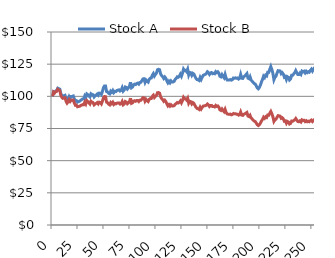
| Category | Stock A | Stock B |
|---|---|---|
| 0.0 | 100 | 100 |
| 1.0 | 103.482 | 103.324 |
| 2.0 | 102.987 | 102.665 |
| 3.0 | 104.154 | 103.666 |
| 4.0 | 104.502 | 103.847 |
| 5.0 | 106.321 | 105.49 |
| 6.0 | 105.913 | 104.918 |
| 7.0 | 105.617 | 104.458 |
| 8.0 | 102.056 | 100.77 |
| 9.0 | 100.69 | 99.262 |
| 10.0 | 100.043 | 98.466 |
| 11.0 | 100.534 | 98.793 |
| 12.0 | 100.836 | 98.933 |
| 13.0 | 98.269 | 96.257 |
| 14.0 | 96.827 | 94.692 |
| 15.0 | 98.031 | 95.72 |
| 16.0 | 99.93 | 97.421 |
| 17.0 | 98.675 | 96.043 |
| 18.0 | 99.88 | 97.063 |
| 19.0 | 99.993 | 97.02 |
| 20.0 | 100.287 | 97.151 |
| 21.0 | 97.98 | 94.761 |
| 22.0 | 96.364 | 93.048 |
| 23.0 | 96.65 | 93.177 |
| 24.0 | 95.479 | 91.9 |
| 25.0 | 95.886 | 92.146 |
| 26.0 | 96.125 | 92.229 |
| 27.0 | 96.912 | 92.838 |
| 28.0 | 97.382 | 93.141 |
| 29.0 | 98.019 | 93.603 |
| 30.0 | 98.065 | 93.498 |
| 31.0 | 100.311 | 95.491 |
| 32.0 | 99.001 | 94.092 |
| 33.0 | 101.878 | 96.677 |
| 34.0 | 101.281 | 95.957 |
| 35.0 | 100.401 | 94.971 |
| 36.0 | 99.585 | 94.048 |
| 37.0 | 101.993 | 96.173 |
| 38.0 | 101.399 | 95.461 |
| 39.0 | 101.207 | 95.128 |
| 40.0 | 99.523 | 93.395 |
| 41.0 | 100.5 | 94.163 |
| 42.0 | 101.056 | 94.534 |
| 43.0 | 101.867 | 95.143 |
| 44.0 | 100.933 | 94.12 |
| 45.0 | 102.502 | 95.434 |
| 46.0 | 102.422 | 95.208 |
| 47.0 | 101.455 | 94.158 |
| 48.0 | 103.865 | 96.245 |
| 49.0 | 106.741 | 98.757 |
| 50.0 | 108.087 | 99.846 |
| 51.0 | 108.09 | 99.69 |
| 52.0 | 103.713 | 95.495 |
| 53.0 | 103.385 | 95.041 |
| 54.0 | 102.368 | 93.955 |
| 55.0 | 101.915 | 93.39 |
| 56.0 | 104.022 | 95.173 |
| 57.0 | 103.231 | 94.298 |
| 58.0 | 104.588 | 95.388 |
| 59.0 | 102.919 | 93.714 |
| 60.0 | 103.911 | 94.469 |
| 61.0 | 103.734 | 94.159 |
| 62.0 | 104.549 | 94.749 |
| 63.0 | 104.855 | 94.875 |
| 64.0 | 105.026 | 94.879 |
| 65.0 | 104.146 | 93.934 |
| 66.0 | 104.646 | 94.236 |
| 67.0 | 106.641 | 95.883 |
| 68.0 | 104.056 | 93.407 |
| 69.0 | 104.942 | 94.053 |
| 70.0 | 107.267 | 95.988 |
| 71.0 | 106.932 | 95.536 |
| 72.0 | 105.653 | 94.242 |
| 73.0 | 106.625 | 94.958 |
| 74.0 | 107.642 | 95.714 |
| 75.0 | 111.021 | 98.566 |
| 76.0 | 106.684 | 94.56 |
| 77.0 | 107.302 | 94.957 |
| 78.0 | 108.952 | 96.266 |
| 79.0 | 109.485 | 96.585 |
| 80.0 | 109.181 | 96.163 |
| 81.0 | 110 | 96.732 |
| 82.0 | 110.263 | 96.809 |
| 83.0 | 109.486 | 95.974 |
| 84.0 | 110.79 | 96.964 |
| 85.0 | 110.978 | 96.975 |
| 86.0 | 112.23 | 97.915 |
| 87.0 | 113.564 | 98.924 |
| 88.0 | 113.596 | 98.795 |
| 89.0 | 110.84 | 96.241 |
| 90.0 | 112.597 | 97.614 |
| 91.0 | 111.574 | 96.572 |
| 92.0 | 111.012 | 95.932 |
| 93.0 | 113.209 | 97.678 |
| 94.0 | 114.055 | 98.253 |
| 95.0 | 114.249 | 98.265 |
| 96.0 | 116.414 | 99.97 |
| 97.0 | 117.651 | 100.875 |
| 98.0 | 115.775 | 99.105 |
| 99.0 | 117.011 | 100.007 |
| 100.0 | 118.086 | 100.766 |
| 101.0 | 120.702 | 102.839 |
| 102.0 | 120.995 | 102.925 |
| 103.0 | 120.645 | 102.464 |
| 104.0 | 117.394 | 99.54 |
| 105.0 | 116.051 | 98.244 |
| 106.0 | 115.331 | 97.478 |
| 107.0 | 113.944 | 96.151 |
| 108.0 | 115.064 | 96.943 |
| 109.0 | 114.048 | 95.933 |
| 110.0 | 112.067 | 94.115 |
| 111.0 | 110.487 | 92.639 |
| 112.0 | 111.78 | 93.576 |
| 113.0 | 110.561 | 92.407 |
| 114.0 | 111.972 | 93.439 |
| 115.0 | 111.096 | 92.56 |
| 116.0 | 111.197 | 92.498 |
| 117.0 | 111.653 | 92.729 |
| 118.0 | 113.178 | 93.849 |
| 119.0 | 114.001 | 94.382 |
| 120.0 | 115.167 | 95.198 |
| 121.0 | 114.864 | 94.797 |
| 122.0 | 115.697 | 95.334 |
| 123.0 | 117.235 | 96.449 |
| 124.0 | 115.598 | 94.95 |
| 125.0 | 117.906 | 96.694 |
| 126.0 | 121.152 | 99.204 |
| 127.0 | 119.925 | 98.041 |
| 128.0 | 120.201 | 98.112 |
| 129.0 | 119.206 | 97.144 |
| 130.0 | 121.105 | 98.537 |
| 131.0 | 116.607 | 94.721 |
| 132.0 | 118.585 | 96.177 |
| 133.0 | 118.346 | 95.83 |
| 134.0 | 116.389 | 94.093 |
| 135.0 | 117.855 | 95.129 |
| 136.0 | 117.294 | 94.525 |
| 137.0 | 115.532 | 92.956 |
| 138.0 | 113.887 | 91.484 |
| 139.0 | 112.99 | 90.619 |
| 140.0 | 112.886 | 90.392 |
| 141.0 | 112.346 | 89.815 |
| 142.0 | 114.735 | 91.583 |
| 143.0 | 113.122 | 90.15 |
| 144.0 | 114.934 | 91.451 |
| 145.0 | 116.348 | 92.431 |
| 146.0 | 116.741 | 92.596 |
| 147.0 | 117.067 | 92.708 |
| 148.0 | 117.818 | 93.155 |
| 149.0 | 119.124 | 94.04 |
| 150.0 | 118.415 | 93.331 |
| 151.0 | 117.041 | 92.1 |
| 152.0 | 118.203 | 92.869 |
| 153.0 | 118.482 | 92.94 |
| 154.0 | 117.592 | 92.094 |
| 155.0 | 117.871 | 92.167 |
| 156.0 | 117.565 | 91.781 |
| 157.0 | 119.207 | 92.917 |
| 158.0 | 118.436 | 92.169 |
| 159.0 | 119.069 | 92.515 |
| 160.0 | 118.061 | 91.585 |
| 161.0 | 115.591 | 89.524 |
| 162.0 | 115.156 | 89.045 |
| 163.0 | 116.853 | 90.216 |
| 164.0 | 115.434 | 88.977 |
| 165.0 | 114.413 | 88.049 |
| 166.0 | 117.031 | 89.923 |
| 167.0 | 114.1 | 87.529 |
| 168.0 | 112.687 | 86.306 |
| 169.0 | 112.631 | 86.126 |
| 170.0 | 112.703 | 86.044 |
| 171.0 | 113.064 | 86.184 |
| 172.0 | 112.553 | 85.657 |
| 173.0 | 113.004 | 85.865 |
| 174.0 | 114.24 | 86.667 |
| 175.0 | 114.015 | 86.359 |
| 176.0 | 114.379 | 86.497 |
| 177.0 | 114.019 | 86.088 |
| 178.0 | 114.249 | 86.125 |
| 179.0 | 113.435 | 85.375 |
| 180.0 | 114.01 | 85.672 |
| 181.0 | 117.023 | 87.8 |
| 182.0 | 114.063 | 85.44 |
| 183.0 | 113.904 | 85.185 |
| 184.0 | 115.206 | 86.024 |
| 185.0 | 115.87 | 86.383 |
| 186.0 | 116.766 | 86.914 |
| 187.0 | 117.689 | 87.463 |
| 188.0 | 114.119 | 84.671 |
| 189.0 | 113.727 | 84.246 |
| 190.0 | 115.279 | 85.262 |
| 191.0 | 112.711 | 83.227 |
| 192.0 | 111.795 | 82.419 |
| 193.0 | 110.811 | 81.562 |
| 194.0 | 109.95 | 80.799 |
| 195.0 | 109.593 | 80.409 |
| 196.0 | 108.08 | 79.171 |
| 197.0 | 106.545 | 77.921 |
| 198.0 | 105.853 | 77.291 |
| 199.0 | 106.904 | 77.936 |
| 200.0 | 108.8 | 79.194 |
| 201.0 | 111.188 | 80.807 |
| 202.0 | 113.123 | 82.085 |
| 203.0 | 115.639 | 83.78 |
| 204.0 | 114.631 | 82.917 |
| 205.0 | 116.452 | 84.103 |
| 206.0 | 115.915 | 83.581 |
| 207.0 | 118.721 | 85.471 |
| 208.0 | 118.663 | 85.294 |
| 209.0 | 121.051 | 86.875 |
| 210.0 | 123.172 | 88.26 |
| 211.0 | 120.836 | 86.446 |
| 212.0 | 117.786 | 84.126 |
| 213.0 | 112.932 | 80.526 |
| 214.0 | 114.878 | 81.786 |
| 215.0 | 115.71 | 82.248 |
| 216.0 | 118.052 | 83.783 |
| 217.0 | 119.956 | 85.001 |
| 218.0 | 119.885 | 84.816 |
| 219.0 | 119.692 | 84.544 |
| 220.0 | 117.61 | 82.939 |
| 221.0 | 118.399 | 83.365 |
| 222.0 | 117.317 | 82.47 |
| 223.0 | 114.907 | 80.645 |
| 224.0 | 115.447 | 80.896 |
| 225.0 | 113.074 | 79.105 |
| 226.0 | 115.218 | 80.479 |
| 227.0 | 114.722 | 80.005 |
| 228.0 | 112.762 | 78.512 |
| 229.0 | 113.56 | 78.942 |
| 230.0 | 116.343 | 80.752 |
| 231.0 | 116.383 | 80.651 |
| 232.0 | 117.41 | 81.235 |
| 233.0 | 118.297 | 81.72 |
| 234.0 | 120.044 | 82.797 |
| 235.0 | 118.406 | 81.535 |
| 236.0 | 116.923 | 80.385 |
| 237.0 | 116.984 | 80.3 |
| 238.0 | 118.142 | 80.967 |
| 239.0 | 117.106 | 80.128 |
| 240.0 | 119.563 | 81.682 |
| 241.0 | 119.015 | 81.178 |
| 242.0 | 119.502 | 81.381 |
| 243.0 | 118.221 | 80.38 |
| 244.0 | 119.43 | 81.074 |
| 245.0 | 118.442 | 80.275 |
| 246.0 | 119.195 | 80.658 |
| 247.0 | 118.772 | 80.243 |
| 248.0 | 120.103 | 81.015 |
| 249.0 | 121.098 | 81.558 |
| 250.0 | 119.635 | 80.443 |
| 251.0 | 121.044 | 81.263 |
| 252.0 | 119.737 | 80.256 |